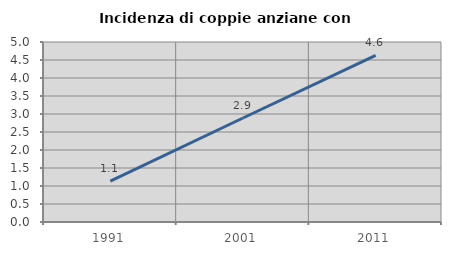
| Category | Incidenza di coppie anziane con figli |
|---|---|
| 1991.0 | 1.137 |
| 2001.0 | 2.888 |
| 2011.0 | 4.628 |